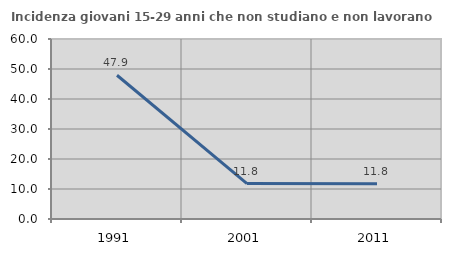
| Category | Incidenza giovani 15-29 anni che non studiano e non lavorano  |
|---|---|
| 1991.0 | 47.922 |
| 2001.0 | 11.801 |
| 2011.0 | 11.774 |